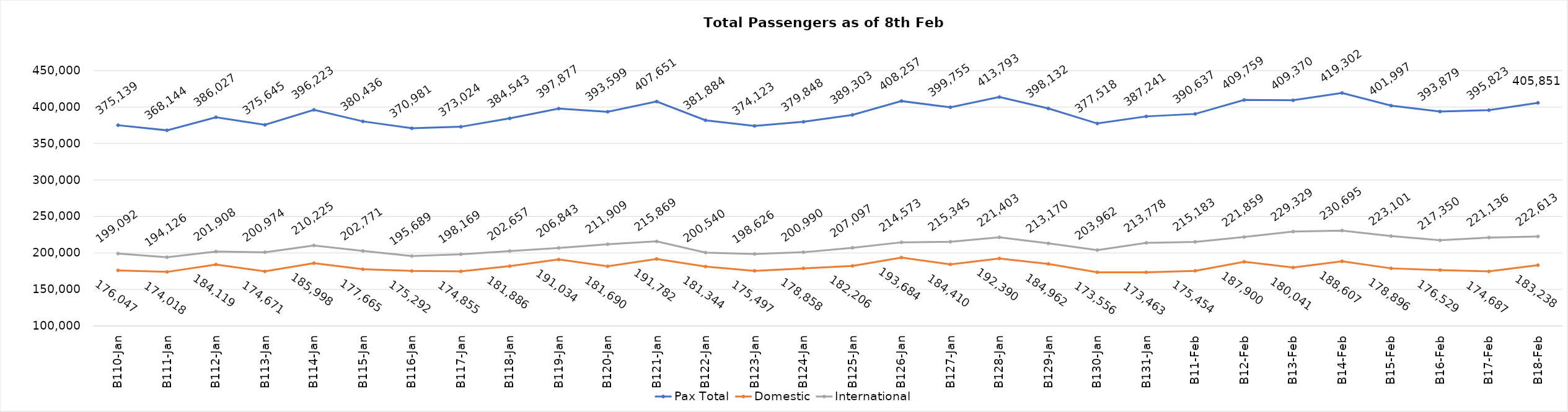
| Category | Pax Total | Domestic | International |
|---|---|---|---|
| 2024-01-10 | 375139 | 176047 | 199092 |
| 2024-01-11 | 368144 | 174018 | 194126 |
| 2024-01-12 | 386027 | 184119 | 201908 |
| 2024-01-13 | 375645 | 174671 | 200974 |
| 2024-01-14 | 396223 | 185998 | 210225 |
| 2024-01-15 | 380436 | 177665 | 202771 |
| 2024-01-16 | 370981 | 175292 | 195689 |
| 2024-01-17 | 373024 | 174855 | 198169 |
| 2024-01-18 | 384543 | 181886 | 202657 |
| 2024-01-19 | 397877 | 191034 | 206843 |
| 2024-01-20 | 393599 | 181690 | 211909 |
| 2024-01-21 | 407651 | 191782 | 215869 |
| 2024-01-22 | 381884 | 181344 | 200540 |
| 2024-01-23 | 374123 | 175497 | 198626 |
| 2024-01-24 | 379848 | 178858 | 200990 |
| 2024-01-25 | 389303 | 182206 | 207097 |
| 2024-01-26 | 408257 | 193684 | 214573 |
| 2024-01-27 | 399755 | 184410 | 215345 |
| 2024-01-28 | 413793 | 192390 | 221403 |
| 2024-01-29 | 398132 | 184962 | 213170 |
| 2024-01-30 | 377518 | 173556 | 203962 |
| 2024-01-31 | 387241 | 173463 | 213778 |
| 2024-02-01 | 390637 | 175454 | 215183 |
| 2024-02-02 | 409759 | 187900 | 221859 |
| 2024-02-03 | 409370 | 180041 | 229329 |
| 2024-02-04 | 419302 | 188607 | 230695 |
| 2024-02-05 | 401997 | 178896 | 223101 |
| 2024-02-06 | 393879 | 176529 | 217350 |
| 2024-02-07 | 395823 | 174687 | 221136 |
| 2024-02-08 | 405851 | 183238 | 222613 |